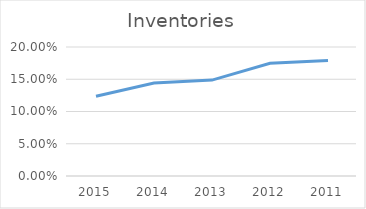
| Category | Inventories |
|---|---|
| 2015.0 | 0.124 |
| 2014.0 | 0.144 |
| 2013.0 | 0.149 |
| 2012.0 | 0.175 |
| 2011.0 | 0.179 |